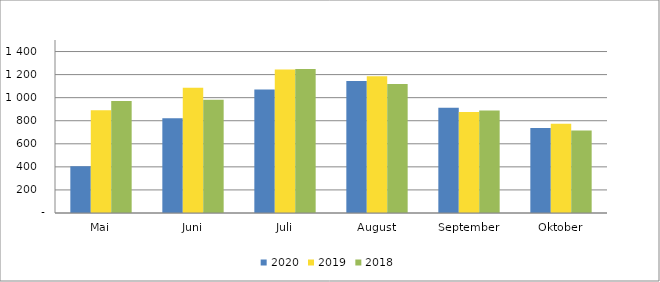
| Category | 2020 | 2019 | 2018 |
|---|---|---|---|
| Mai | 404870 | 891354 | 970092 |
| Juni | 820867 | 1086638 | 981014 |
| Juli | 1070071 | 1244103 | 1247752 |
| August | 1144363 | 1184768 | 1118902 |
| September | 913446 | 875331 | 887790 |
| Oktober | 736892 | 773129 | 714564 |